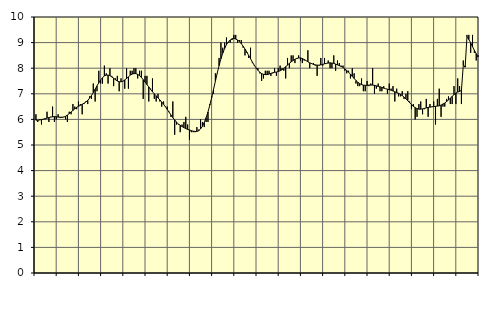
| Category | Piggar | Series 1 |
|---|---|---|
| nan | 6.2 | 5.97 |
| 1.0 | 5.9 | 5.97 |
| 1.0 | 6 | 5.98 |
| 1.0 | 5.8 | 5.99 |
| 1.0 | 6 | 6.01 |
| 1.0 | 6 | 6.03 |
| 1.0 | 6.3 | 6.05 |
| 1.0 | 5.9 | 6.07 |
| 1.0 | 6.1 | 6.09 |
| 1.0 | 6.5 | 6.1 |
| 1.0 | 5.9 | 6.11 |
| 1.0 | 6 | 6.1 |
| nan | 6.2 | 6.09 |
| 2.0 | 6.1 | 6.08 |
| 2.0 | 6.1 | 6.08 |
| 2.0 | 6.1 | 6.09 |
| 2.0 | 6 | 6.12 |
| 2.0 | 5.9 | 6.17 |
| 2.0 | 6.3 | 6.23 |
| 2.0 | 6.2 | 6.29 |
| 2.0 | 6.6 | 6.35 |
| 2.0 | 6.5 | 6.41 |
| 2.0 | 6.4 | 6.47 |
| 2.0 | 6.7 | 6.51 |
| nan | 6.6 | 6.55 |
| 3.0 | 6.2 | 6.59 |
| 3.0 | 6.6 | 6.63 |
| 3.0 | 6.7 | 6.68 |
| 3.0 | 6.6 | 6.74 |
| 3.0 | 6.9 | 6.83 |
| 3.0 | 6.8 | 6.93 |
| 3.0 | 7.4 | 7.05 |
| 3.0 | 6.7 | 7.18 |
| 3.0 | 7.1 | 7.31 |
| 3.0 | 7.9 | 7.43 |
| 3.0 | 7.4 | 7.54 |
| nan | 7.4 | 7.63 |
| 4.0 | 8.1 | 7.7 |
| 4.0 | 7.8 | 7.73 |
| 4.0 | 7.4 | 7.73 |
| 4.0 | 8 | 7.71 |
| 4.0 | 7.7 | 7.66 |
| 4.0 | 7.3 | 7.61 |
| 4.0 | 7.6 | 7.55 |
| 4.0 | 7.7 | 7.5 |
| 4.0 | 7.1 | 7.47 |
| 4.0 | 7.6 | 7.47 |
| 4.0 | 7.5 | 7.49 |
| nan | 7.2 | 7.54 |
| 5.0 | 8 | 7.6 |
| 5.0 | 7.2 | 7.66 |
| 5.0 | 7.9 | 7.73 |
| 5.0 | 7.9 | 7.77 |
| 5.0 | 8 | 7.79 |
| 5.0 | 8 | 7.79 |
| 5.0 | 7.6 | 7.76 |
| 5.0 | 7.9 | 7.71 |
| 5.0 | 7.9 | 7.64 |
| 5.0 | 6.8 | 7.55 |
| 5.0 | 7.7 | 7.46 |
| nan | 7.7 | 7.36 |
| 6.0 | 6.7 | 7.27 |
| 6.0 | 7.2 | 7.17 |
| 6.0 | 7.6 | 7.08 |
| 6.0 | 6.8 | 7 |
| 6.0 | 6.7 | 6.92 |
| 6.0 | 7 | 6.84 |
| 6.0 | 6.7 | 6.76 |
| 6.0 | 6.5 | 6.68 |
| 6.0 | 6.7 | 6.59 |
| 6.0 | 6.5 | 6.49 |
| 6.0 | 6.5 | 6.39 |
| nan | 6.3 | 6.28 |
| 7.0 | 6.1 | 6.17 |
| 7.0 | 6.7 | 6.07 |
| 7.0 | 5.4 | 5.98 |
| 7.0 | 5.8 | 5.89 |
| 7.0 | 5.8 | 5.82 |
| 7.0 | 5.5 | 5.77 |
| 7.0 | 5.8 | 5.72 |
| 7.0 | 5.9 | 5.68 |
| 7.0 | 6.1 | 5.64 |
| 7.0 | 5.8 | 5.61 |
| 7.0 | 5.2 | 5.59 |
| nan | 5.5 | 5.56 |
| 8.0 | 5.5 | 5.54 |
| 8.0 | 5.5 | 5.53 |
| 8.0 | 5.7 | 5.53 |
| 8.0 | 5.6 | 5.56 |
| 8.0 | 6 | 5.63 |
| 8.0 | 5.9 | 5.73 |
| 8.0 | 5.7 | 5.88 |
| 8.0 | 5.9 | 6.07 |
| 8.0 | 5.9 | 6.29 |
| 8.0 | 6.6 | 6.56 |
| 8.0 | 6.9 | 6.85 |
| nan | 7 | 7.17 |
| 9.0 | 7.8 | 7.49 |
| 9.0 | 7.8 | 7.81 |
| 9.0 | 8.4 | 8.1 |
| 9.0 | 9 | 8.37 |
| 9.0 | 8.8 | 8.59 |
| 9.0 | 9 | 8.77 |
| 9.0 | 9.2 | 8.92 |
| 9.0 | 9 | 9.03 |
| 9.0 | 9 | 9.1 |
| 9.0 | 9.1 | 9.15 |
| 9.0 | 9.3 | 9.16 |
| nan | 9.3 | 9.14 |
| 10.0 | 9 | 9.1 |
| 10.0 | 9.1 | 9.04 |
| 10.0 | 9.1 | 8.96 |
| 10.0 | 8.8 | 8.86 |
| 10.0 | 8.5 | 8.75 |
| 10.0 | 8.6 | 8.63 |
| 10.0 | 8.4 | 8.5 |
| 10.0 | 8.8 | 8.37 |
| 10.0 | 8.2 | 8.24 |
| 10.0 | 8.1 | 8.12 |
| 10.0 | 8 | 8.01 |
| nan | 8 | 7.92 |
| 11.0 | 7.8 | 7.84 |
| 11.0 | 7.5 | 7.79 |
| 11.0 | 7.6 | 7.76 |
| 11.0 | 7.9 | 7.75 |
| 11.0 | 7.9 | 7.75 |
| 11.0 | 7.9 | 7.77 |
| 11.0 | 7.7 | 7.8 |
| 11.0 | 7.8 | 7.82 |
| 11.0 | 8 | 7.84 |
| 11.0 | 7.7 | 7.85 |
| 11.0 | 8 | 7.87 |
| nan | 8.1 | 7.9 |
| 12.0 | 8 | 7.94 |
| 12.0 | 7.9 | 7.99 |
| 12.0 | 7.6 | 8.06 |
| 12.0 | 8.4 | 8.12 |
| 12.0 | 8 | 8.19 |
| 12.0 | 8.5 | 8.25 |
| 12.0 | 8.5 | 8.3 |
| 12.0 | 8.2 | 8.35 |
| 12.0 | 8.4 | 8.38 |
| 12.0 | 8.5 | 8.4 |
| 12.0 | 8.3 | 8.4 |
| nan | 8.2 | 8.38 |
| 13.0 | 8.3 | 8.34 |
| 13.0 | 8.3 | 8.3 |
| 13.0 | 8.7 | 8.25 |
| 13.0 | 8 | 8.21 |
| 13.0 | 8.2 | 8.18 |
| 13.0 | 8.2 | 8.15 |
| 13.0 | 8.1 | 8.13 |
| 13.0 | 7.7 | 8.12 |
| 13.0 | 8.1 | 8.12 |
| 13.0 | 8.4 | 8.13 |
| 13.0 | 8.1 | 8.15 |
| nan | 8.4 | 8.17 |
| 14.0 | 8.2 | 8.19 |
| 14.0 | 8.3 | 8.2 |
| 14.0 | 8 | 8.21 |
| 14.0 | 8 | 8.2 |
| 14.0 | 8.5 | 8.19 |
| 14.0 | 7.9 | 8.16 |
| 14.0 | 8.3 | 8.13 |
| 14.0 | 8.2 | 8.1 |
| 14.0 | 8.1 | 8.07 |
| 14.0 | 8.1 | 8.03 |
| 14.0 | 7.9 | 7.97 |
| nan | 7.8 | 7.91 |
| 15.0 | 7.9 | 7.84 |
| 15.0 | 7.6 | 7.77 |
| 15.0 | 8 | 7.68 |
| 15.0 | 7.8 | 7.6 |
| 15.0 | 7.4 | 7.52 |
| 15.0 | 7.3 | 7.45 |
| 15.0 | 7.3 | 7.4 |
| 15.0 | 7.6 | 7.36 |
| 15.0 | 7.1 | 7.34 |
| 15.0 | 7.1 | 7.33 |
| 15.0 | 7.5 | 7.33 |
| nan | 7.3 | 7.34 |
| 16.0 | 7.4 | 7.34 |
| 16.0 | 8 | 7.34 |
| 16.0 | 7 | 7.33 |
| 16.0 | 7.2 | 7.31 |
| 16.0 | 7.4 | 7.29 |
| 16.0 | 7.1 | 7.27 |
| 16.0 | 7.1 | 7.25 |
| 16.0 | 7.3 | 7.22 |
| 16.0 | 7.2 | 7.2 |
| 16.0 | 7 | 7.18 |
| 16.0 | 7.4 | 7.16 |
| nan | 7.2 | 7.14 |
| 17.0 | 7.3 | 7.11 |
| 17.0 | 6.7 | 7.08 |
| 17.0 | 7.2 | 7.05 |
| 17.0 | 6.9 | 7.02 |
| 17.0 | 6.9 | 6.98 |
| 17.0 | 7.1 | 6.93 |
| 17.0 | 6.8 | 6.87 |
| 17.0 | 7 | 6.8 |
| 17.0 | 7.1 | 6.73 |
| 17.0 | 6.7 | 6.65 |
| 17.0 | 6.4 | 6.58 |
| nan | 6.6 | 6.51 |
| 18.0 | 6 | 6.46 |
| 18.0 | 6.1 | 6.42 |
| 18.0 | 6.6 | 6.4 |
| 18.0 | 6.7 | 6.4 |
| 18.0 | 6.2 | 6.41 |
| 18.0 | 6.4 | 6.43 |
| 18.0 | 6.8 | 6.45 |
| 18.0 | 6.1 | 6.47 |
| 18.0 | 6.6 | 6.48 |
| 18.0 | 6.5 | 6.49 |
| 18.0 | 6.7 | 6.5 |
| nan | 5.8 | 6.51 |
| 19.0 | 6.8 | 6.52 |
| 19.0 | 7.2 | 6.53 |
| 19.0 | 6.1 | 6.56 |
| 19.0 | 6.5 | 6.6 |
| 19.0 | 6.5 | 6.64 |
| 19.0 | 6.8 | 6.7 |
| 19.0 | 6.9 | 6.76 |
| 19.0 | 6.6 | 6.83 |
| 19.0 | 6.6 | 6.9 |
| 19.0 | 7.3 | 6.97 |
| 19.0 | 6.6 | 7.03 |
| nan | 7.6 | 7.07 |
| 20.0 | 7.3 | 7.09 |
| 20.0 | 6.6 | 7.14 |
| 20.0 | 8.3 | 8.11 |
| 20.0 | 8.1 | 8.04 |
| 20.0 | 9.3 | 9.24 |
| 20.0 | 9.3 | 9.12 |
| 20.0 | 8.6 | 8.99 |
| 20.0 | 9.3 | 8.84 |
| 20.0 | 8.6 | 8.7 |
| 20.0 | 8.3 | 8.57 |
| 20.0 | 8.5 | 8.44 |